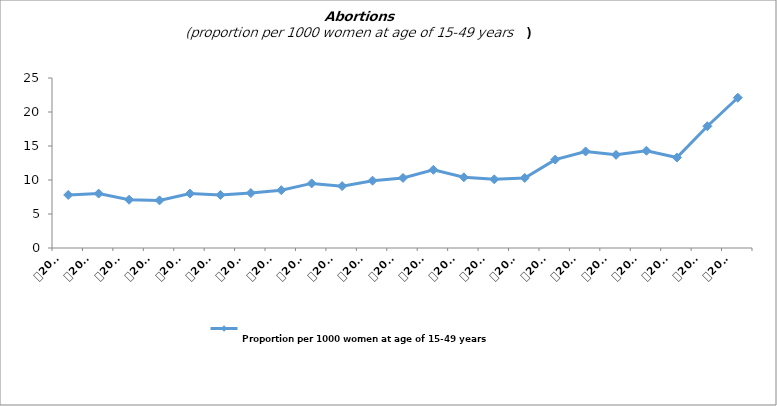
| Category |   
Proportion per 1000 women at age of 15-49 years |
|---|---|
| 0 | 7.8 |
| 1 | 8 |
| 2 | 7.1 |
| 3 | 7 |
| 4 | 8 |
| 5 | 7.8 |
| 6 | 8.079 |
| 7 | 8.5 |
| 8 | 9.5 |
| 9 | 9.1 |
| 10 | 9.9 |
| 11 | 10.3 |
| 12 | 11.5 |
| 13 | 10.4 |
| 14 | 10.1 |
| 15 | 10.3 |
| 16 | 13 |
| 17 | 14.2 |
| 18 | 13.7 |
| 19 | 14.3 |
| 20 | 13.3 |
| 21 | 17.9 |
| 22 | 22.1 |